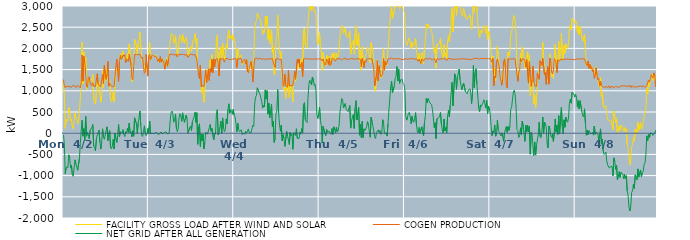
| Category | FACILITY GROSS LOAD AFTER WIND AND SOLAR | COGEN PRODUCTION | NET GRID AFTER ALL GENERATION |
|---|---|---|---|
|  Mon  4/2 | 1227 | 1265 | -38 |
|  Mon  4/2 | 881 | 1117 | -236 |
|  Mon  4/2 | 114 | 1072 | -958 |
|  Mon  4/2 | 292 | 1110 | -818 |
|  Mon  4/2 | 326 | 1113 | -787 |
|  Mon  4/2 | 286 | 1098 | -812 |
|  Mon  4/2 | 604 | 1113 | -509 |
|  Mon  4/2 | 536 | 1104 | -568 |
|  Mon  4/2 | 297 | 1119 | -822 |
|  Mon  4/2 | 323 | 1080 | -757 |
|  Mon  4/2 | 146 | 1119 | -973 |
|  Mon  4/2 | 102 | 1120 | -1018 |
|  Mon  4/2 | 311 | 1129 | -818 |
|  Mon  4/2 | 479 | 1109 | -630 |
|  Mon  4/2 | 360 | 1078 | -718 |
|  Mon  4/2 | 315 | 1118 | -803 |
|  Mon  4/2 | 221 | 1096 | -875 |
|  Mon  4/2 | 252 | 1116 | -864 |
|  Mon  4/2 | 519 | 1111 | -592 |
|  Mon  4/2 | 826 | 1068 | -242 |
|  Mon  4/2 | 1263 | 1190 | 73 |
|  Mon  4/2 | 2147 | 1844 | 303 |
|  Mon  4/2 | 1159 | 1230 | -71 |
|  Mon  4/2 | 1917 | 1810 | 107 |
|  Mon  4/2 | 1500 | 1674 | -174 |
|  Mon  4/2 | 1788 | 1394 | 394 |
|  Mon  4/2 | 1034 | 1105 | -71 |
|  Mon  4/2 | 1096 | 1081 | 15 |
|  Mon  4/2 | 1267 | 1295 | -28 |
|  Mon  4/2 | 1197 | 1327 | -130 |
|  Mon  4/2 | 1254 | 1184 | 70 |
|  Mon  4/2 | 1237 | 1166 | 71 |
|  Mon  4/2 | 1258 | 1118 | 140 |
|  Mon  4/2 | 1393 | 1189 | 204 |
|  Mon  4/2 | 793 | 1104 | -311 |
|  Mon  4/2 | 773 | 1110 | -337 |
|  Mon  4/2 | 686 | 1104 | -418 |
|  Mon  4/2 | 962 | 1109 | -147 |
|  Mon  4/2 | 1361 | 1402 | -41 |
|  Mon  4/2 | 1109 | 1164 | -55 |
|  Mon  4/2 | 1200 | 1125 | 75 |
|  Mon  4/2 | 904 | 1117 | -213 |
|  Mon  4/2 | 729 | 1104 | -375 |
|  Mon  4/2 | 880 | 1084 | -204 |
|  Mon  4/2 | 1492 | 1388 | 104 |
|  Mon  4/2 | 1077 | 1171 | -94 |
|  Mon  4/2 | 1456 | 1601 | -145 |
|  Mon  4/2 | 1241 | 1405 | -164 |
|  Mon  4/2 | 1331 | 1270 | 61 |
|  Mon  4/2 | 1533 | 1382 | 151 |
|  Mon  4/2 | 1517 | 1694 | -177 |
|  Mon  4/2 | 1113 | 1109 | 4 |
|  Mon  4/2 | 1236 | 1174 | 62 |
|  Mon  4/2 | 789 | 1128 | -339 |
|  Mon  4/2 | 745 | 1116 | -371 |
|  Mon  4/2 | 802 | 1098 | -296 |
|  Mon  4/2 | 972 | 1112 | -140 |
|  Mon  4/2 | 734 | 1105 | -371 |
|  Mon  4/2 | 1343 | 1340 | 3 |
|  Mon  4/2 | 1459 | 1590 | -131 |
|  Mon  4/2 | 1526 | 1744 | -218 |
|  Mon  4/2 | 1399 | 1463 | -64 |
|  Mon  4/2 | 1427 | 1220 | 207 |
|  Mon  4/2 | 1597 | 1684 | -87 |
|  Mon  4/2 | 1875 | 1843 | 32 |
|  Mon  4/2 | 1770 | 1745 | 25 |
|  Mon  4/2 | 1769 | 1771 | -2 |
|  Mon  4/2 | 1933 | 1849 | 84 |
|  Mon  4/2 | 1783 | 1811 | -28 |
|  Mon  4/2 | 1772 | 1852 | -80 |
|  Mon  4/2 | 1702 | 1664 | 38 |
|  Mon  4/2 | 1754 | 1752 | 2 |
|  Mon  4/2 | 1876 | 1754 | 122 |
|  Mon  4/2 | 1714 | 1693 | 21 |
|  Mon  4/2 | 2104 | 1864 | 240 |
|  Mon  4/2 | 1862 | 1858 | 4 |
|  Mon  4/2 | 1646 | 1611 | 35 |
|  Mon  4/2 | 1212 | 1297 | -85 |
|  Mon  4/2 | 1315 | 1256 | 59 |
|  Mon  4/2 | 1502 | 1573 | -71 |
|  Mon  4/2 | 2218 | 1853 | 365 |
|  Mon  4/2 | 2206 | 1836 | 370 |
|  Mon  4/2 | 2082 | 1853 | 229 |
|  Mon  4/2 | 1841 | 1850 | -9 |
|  Mon  4/2 | 2089 | 1854 | 235 |
|  Mon  4/2 | 2215 | 1851 | 364 |
|  Mon  4/2 | 2387 | 1862 | 525 |
|  Mon  4/2 | 2028 | 1853 | 175 |
|  Mon  4/2 | 1723 | 1764 | -41 |
|  Mon  4/2 | 1718 | 1797 | -79 |
|  Mon  4/2 | 1618 | 1576 | 42 |
|  Mon  4/2 | 1586 | 1413 | 173 |
|  Mon  4/2 | 1436 | 1445 | -9 |
|  Mon  4/2 | 1798 | 1857 | -59 |
|  Mon  4/2 | 1521 | 1540 | -19 |
|  Mon  4/2 | 1458 | 1346 | 112 |
|  Tue  4/3 | 1811 | 1821 | -10 |
|  Tue  4/3 | 2143 | 1862 | 281 |
|  Tue  4/3 | 1724 | 1734 | -10 |
|  Tue  4/3 | 1807 | 1812 | -5 |
|  Tue  4/3 | 1837 | 1841 | -4 |
|  Tue  4/3 | 1851 | 1841 | 10 |
|  Tue  4/3 | 1805 | 1814 | -9 |
|  Tue  4/3 | 1810 | 1794 | 16 |
|  Tue  4/3 | 1848 | 1812 | 36 |
|  Tue  4/3 | 1783 | 1771 | 12 |
|  Tue  4/3 | 1717 | 1694 | 23 |
|  Tue  4/3 | 1713 | 1753 | -40 |
|  Tue  4/3 | 1668 | 1672 | -4 |
|  Tue  4/3 | 1792 | 1806 | -14 |
|  Tue  4/3 | 1704 | 1676 | 28 |
|  Tue  4/3 | 1735 | 1748 | -13 |
|  Tue  4/3 | 1737 | 1735 | 2 |
|  Tue  4/3 | 1661 | 1654 | 7 |
|  Tue  4/3 | 1516 | 1510 | 6 |
|  Tue  4/3 | 1704 | 1668 | 36 |
|  Tue  4/3 | 1779 | 1732 | 47 |
|  Tue  4/3 | 1564 | 1581 | -17 |
|  Tue  4/3 | 1674 | 1699 | -25 |
|  Tue  4/3 | 1864 | 1860 | 4 |
|  Tue  4/3 | 2152 | 1864 | 288 |
|  Tue  4/3 | 2340 | 1859 | 481 |
|  Tue  4/3 | 2360 | 1838 | 522 |
|  Tue  4/3 | 2331 | 1866 | 465 |
|  Tue  4/3 | 2120 | 1860 | 260 |
|  Tue  4/3 | 2144 | 1838 | 306 |
|  Tue  4/3 | 2302 | 1852 | 450 |
|  Tue  4/3 | 1991 | 1868 | 123 |
|  Tue  4/3 | 1833 | 1796 | 37 |
|  Tue  4/3 | 1943 | 1852 | 91 |
|  Tue  4/3 | 2225 | 1859 | 366 |
|  Tue  4/3 | 2311 | 1853 | 458 |
|  Tue  4/3 | 2266 | 1857 | 409 |
|  Tue  4/3 | 2140 | 1859 | 281 |
|  Tue  4/3 | 2327 | 1847 | 480 |
|  Tue  4/3 | 2213 | 1858 | 355 |
|  Tue  4/3 | 2118 | 1861 | 257 |
|  Tue  4/3 | 2105 | 1842 | 263 |
|  Tue  4/3 | 2257 | 1833 | 424 |
|  Tue  4/3 | 2194 | 1851 | 343 |
|  Tue  4/3 | 1783 | 1784 | -1 |
|  Tue  4/3 | 1778 | 1788 | -10 |
|  Tue  4/3 | 1984 | 1854 | 130 |
|  Tue  4/3 | 2038 | 1869 | 169 |
|  Tue  4/3 | 1922 | 1862 | 60 |
|  Tue  4/3 | 2115 | 1844 | 271 |
|  Tue  4/3 | 2098 | 1846 | 252 |
|  Tue  4/3 | 2243 | 1853 | 390 |
|  Tue  4/3 | 2348 | 1854 | 494 |
|  Tue  4/3 | 2118 | 1862 | 256 |
|  Tue  4/3 | 2234 | 1751 | 483 |
|  Tue  4/3 | 1484 | 1746 | -262 |
|  Tue  4/3 | 1511 | 1360 | 151 |
|  Tue  4/3 | 1507 | 1286 | 221 |
|  Tue  4/3 | 1284 | 1598 | -314 |
|  Tue  4/3 | 1073 | 1091 | -18 |
|  Tue  4/3 | 945 | 1127 | -182 |
|  Tue  4/3 | 1083 | 1107 | -24 |
|  Tue  4/3 | 731 | 1101 | -370 |
|  Tue  4/3 | 893 | 1107 | -214 |
|  Tue  4/3 | 1513 | 1490 | 23 |
|  Tue  4/3 | 1227 | 1192 | 35 |
|  Tue  4/3 | 1337 | 1360 | -23 |
|  Tue  4/3 | 1505 | 1506 | -1 |
|  Tue  4/3 | 1373 | 1244 | 129 |
|  Tue  4/3 | 1729 | 1524 | 205 |
|  Tue  4/3 | 1486 | 1439 | 47 |
|  Tue  4/3 | 1855 | 1740 | 115 |
|  Tue  4/3 | 1542 | 1428 | 114 |
|  Tue  4/3 | 1595 | 1752 | -157 |
|  Tue  4/3 | 1564 | 1562 | 2 |
|  Tue  4/3 | 1717 | 1739 | -22 |
|  Tue  4/3 | 2206 | 1757 | 449 |
|  Tue  4/3 | 2310 | 1757 | 553 |
|  Tue  4/3 | 1625 | 1662 | -37 |
|  Tue  4/3 | 1351 | 1348 | 3 |
|  Tue  4/3 | 1917 | 1759 | 158 |
|  Tue  4/3 | 2030 | 1746 | 284 |
|  Tue  4/3 | 1749 | 1753 | -4 |
|  Tue  4/3 | 2120 | 1759 | 361 |
|  Tue  4/3 | 1884 | 1754 | 130 |
|  Tue  4/3 | 1711 | 1675 | 36 |
|  Tue  4/3 | 1832 | 1749 | 83 |
|  Tue  4/3 | 2087 | 1750 | 337 |
|  Tue  4/3 | 1987 | 1768 | 219 |
|  Tue  4/3 | 2306 | 1750 | 556 |
|  Tue  4/3 | 2430 | 1737 | 693 |
|  Tue  4/3 | 2226 | 1755 | 471 |
|  Tue  4/3 | 2298 | 1740 | 558 |
|  Tue  4/3 | 2273 | 1761 | 512 |
|  Tue  4/3 | 2191 | 1744 | 447 |
|  Tue  4/3 | 2325 | 1763 | 562 |
|  Wed  4/4 | 2177 | 1757 | 420 |
|  Wed  4/4 | 2142 | 1758 | 384 |
|  Wed  4/4 | 1984 | 1755 | 229 |
|  Wed  4/4 | 1579 | 1546 | 33 |
|  Wed  4/4 | 1996 | 1756 | 240 |
|  Wed  4/4 | 1840 | 1756 | 84 |
|  Wed  4/4 | 1788 | 1749 | 39 |
|  Wed  4/4 | 1817 | 1768 | 49 |
|  Wed  4/4 | 1846 | 1766 | 80 |
|  Wed  4/4 | 1612 | 1650 | -38 |
|  Wed  4/4 | 1659 | 1699 | -40 |
|  Wed  4/4 | 1694 | 1687 | 7 |
|  Wed  4/4 | 1722 | 1746 | -24 |
|  Wed  4/4 | 1675 | 1633 | 42 |
|  Wed  4/4 | 1737 | 1734 | 3 |
|  Wed  4/4 | 1433 | 1451 | -18 |
|  Wed  4/4 | 1523 | 1422 | 101 |
|  Wed  4/4 | 1534 | 1522 | 12 |
|  Wed  4/4 | 1523 | 1510 | 13 |
|  Wed  4/4 | 1704 | 1689 | 15 |
|  Wed  4/4 | 1541 | 1533 | 8 |
|  Wed  4/4 | 1395 | 1206 | 189 |
|  Wed  4/4 | 1675 | 1513 | 162 |
|  Wed  4/4 | 2440 | 1755 | 685 |
|  Wed  4/4 | 2599 | 1750 | 849 |
|  Wed  4/4 | 2654 | 1770 | 884 |
|  Wed  4/4 | 2826 | 1755 | 1071 |
|  Wed  4/4 | 2827 | 1747 | 1080 |
|  Wed  4/4 | 2716 | 1758 | 958 |
|  Wed  4/4 | 2695 | 1769 | 926 |
|  Wed  4/4 | 2658 | 1754 | 904 |
|  Wed  4/4 | 2494 | 1746 | 748 |
|  Wed  4/4 | 2335 | 1742 | 593 |
|  Wed  4/4 | 2417 | 1752 | 665 |
|  Wed  4/4 | 2376 | 1756 | 620 |
|  Wed  4/4 | 2759 | 1739 | 1020 |
|  Wed  4/4 | 2559 | 1752 | 807 |
|  Wed  4/4 | 2761 | 1758 | 1003 |
|  Wed  4/4 | 2213 | 1764 | 449 |
|  Wed  4/4 | 2452 | 1745 | 707 |
|  Wed  4/4 | 2117 | 1752 | 365 |
|  Wed  4/4 | 2293 | 1756 | 537 |
|  Wed  4/4 | 2447 | 1764 | 683 |
|  Wed  4/4 | 1905 | 1755 | 150 |
|  Wed  4/4 | 2036 | 1758 | 278 |
|  Wed  4/4 | 1384 | 1601 | -217 |
|  Wed  4/4 | 1435 | 1551 | -116 |
|  Wed  4/4 | 2204 | 1752 | 452 |
|  Wed  4/4 | 2283 | 1750 | 533 |
|  Wed  4/4 | 2788 | 1762 | 1026 |
|  Wed  4/4 | 2243 | 1763 | 480 |
|  Wed  4/4 | 1922 | 1736 | 186 |
|  Wed  4/4 | 1772 | 1725 | 47 |
|  Wed  4/4 | 1934 | 1744 | 190 |
|  Wed  4/4 | 1310 | 1486 | -176 |
|  Wed  4/4 | 1071 | 1106 | -35 |
|  Wed  4/4 | 1022 | 1143 | -121 |
|  Wed  4/4 | 1077 | 1388 | -311 |
|  Wed  4/4 | 817 | 1121 | -304 |
|  Wed  4/4 | 1165 | 1122 | 43 |
|  Wed  4/4 | 1028 | 1085 | -57 |
|  Wed  4/4 | 1424 | 1485 | -61 |
|  Wed  4/4 | 849 | 1116 | -267 |
|  Wed  4/4 | 1140 | 1119 | 21 |
|  Wed  4/4 | 1066 | 1128 | -62 |
|  Wed  4/4 | 1089 | 1114 | -25 |
|  Wed  4/4 | 740 | 1119 | -379 |
|  Wed  4/4 | 1294 | 1279 | 15 |
|  Wed  4/4 | 1436 | 1458 | -22 |
|  Wed  4/4 | 1218 | 1271 | -53 |
|  Wed  4/4 | 1375 | 1270 | 105 |
|  Wed  4/4 | 1621 | 1742 | -121 |
|  Wed  4/4 | 1518 | 1658 | -140 |
|  Wed  4/4 | 1625 | 1750 | -125 |
|  Wed  4/4 | 1588 | 1559 | 29 |
|  Wed  4/4 | 1568 | 1591 | -23 |
|  Wed  4/4 | 1776 | 1667 | 109 |
|  Wed  4/4 | 1334 | 1330 | 4 |
|  Wed  4/4 | 2425 | 1753 | 672 |
|  Wed  4/4 | 2480 | 1761 | 719 |
|  Wed  4/4 | 2077 | 1759 | 318 |
|  Wed  4/4 | 2036 | 1761 | 275 |
|  Wed  4/4 | 2004 | 1753 | 251 |
|  Wed  4/4 | 2586 | 1758 | 828 |
|  Wed  4/4 | 2891 | 1749 | 1142 |
|  Wed  4/4 | 3004 | 1756 | 1248 |
|  Wed  4/4 | 3007 | 1750 | 1257 |
|  Wed  4/4 | 2885 | 1744 | 1141 |
|  Wed  4/4 | 3069 | 1743 | 1326 |
|  Wed  4/4 | 3009 | 1753 | 1256 |
|  Wed  4/4 | 2876 | 1752 | 1124 |
|  Wed  4/4 | 2912 | 1759 | 1153 |
|  Wed  4/4 | 2750 | 1750 | 1000 |
|  Wed  4/4 | 2200 | 1754 | 446 |
|  Wed  4/4 | 2094 | 1747 | 347 |
|  Wed  4/4 | 2206 | 1759 | 447 |
|  Thu  4/5 | 2375 | 1759 | 616 |
|  Thu  4/5 | 2046 | 1749 | 297 |
|  Thu  4/5 | 1929 | 1744 | 185 |
|  Thu  4/5 | 1470 | 1703 | -233 |
|  Thu  4/5 | 1911 | 1748 | 163 |
|  Thu  4/5 | 1926 | 1765 | 161 |
|  Thu  4/5 | 1606 | 1604 | 2 |
|  Thu  4/5 | 1575 | 1632 | -57 |
|  Thu  4/5 | 1838 | 1751 | 87 |
|  Thu  4/5 | 1732 | 1709 | 23 |
|  Thu  4/5 | 1636 | 1619 | 17 |
|  Thu  4/5 | 1813 | 1766 | 47 |
|  Thu  4/5 | 1598 | 1599 | -1 |
|  Thu  4/5 | 1601 | 1628 | -27 |
|  Thu  4/5 | 1872 | 1762 | 110 |
|  Thu  4/5 | 1730 | 1757 | -27 |
|  Thu  4/5 | 1902 | 1751 | 151 |
|  Thu  4/5 | 1839 | 1740 | 99 |
|  Thu  4/5 | 1701 | 1698 | 3 |
|  Thu  4/5 | 1896 | 1757 | 139 |
|  Thu  4/5 | 1789 | 1756 | 33 |
|  Thu  4/5 | 1816 | 1751 | 65 |
|  Thu  4/5 | 1952 | 1760 | 192 |
|  Thu  4/5 | 2274 | 1763 | 511 |
|  Thu  4/5 | 2422 | 1768 | 654 |
|  Thu  4/5 | 2544 | 1726 | 818 |
|  Thu  4/5 | 2512 | 1739 | 773 |
|  Thu  4/5 | 2359 | 1759 | 600 |
|  Thu  4/5 | 2352 | 1745 | 607 |
|  Thu  4/5 | 2472 | 1771 | 701 |
|  Thu  4/5 | 2295 | 1732 | 563 |
|  Thu  4/5 | 2292 | 1746 | 546 |
|  Thu  4/5 | 2259 | 1750 | 509 |
|  Thu  4/5 | 2245 | 1731 | 514 |
|  Thu  4/5 | 2403 | 1749 | 654 |
|  Thu  4/5 | 1860 | 1740 | 120 |
|  Thu  4/5 | 2047 | 1762 | 285 |
|  Thu  4/5 | 2156 | 1774 | 382 |
|  Thu  4/5 | 2190 | 1754 | 436 |
|  Thu  4/5 | 1863 | 1748 | 115 |
|  Thu  4/5 | 2337 | 1746 | 591 |
|  Thu  4/5 | 2531 | 1762 | 769 |
|  Thu  4/5 | 2071 | 1758 | 313 |
|  Thu  4/5 | 2213 | 1746 | 467 |
|  Thu  4/5 | 2368 | 1756 | 612 |
|  Thu  4/5 | 1695 | 1742 | -47 |
|  Thu  4/5 | 1946 | 1737 | 209 |
|  Thu  4/5 | 1469 | 1570 | -101 |
|  Thu  4/5 | 2038 | 1762 | 276 |
|  Thu  4/5 | 1588 | 1694 | -106 |
|  Thu  4/5 | 1653 | 1550 | 103 |
|  Thu  4/5 | 1773 | 1704 | 69 |
|  Thu  4/5 | 1772 | 1673 | 99 |
|  Thu  4/5 | 1909 | 1745 | 164 |
|  Thu  4/5 | 2029 | 1758 | 271 |
|  Thu  4/5 | 1948 | 1760 | 188 |
|  Thu  4/5 | 1796 | 1758 | 38 |
|  Thu  4/5 | 1656 | 1752 | -96 |
|  Thu  4/5 | 2136 | 1763 | 373 |
|  Thu  4/5 | 2037 | 1756 | 281 |
|  Thu  4/5 | 1940 | 1762 | 178 |
|  Thu  4/5 | 1729 | 1530 | 199 |
|  Thu  4/5 | 1027 | 1114 | -87 |
|  Thu  4/5 | 981 | 1105 | -124 |
|  Thu  4/5 | 1361 | 1348 | 13 |
|  Thu  4/5 | 1739 | 1712 | 27 |
|  Thu  4/5 | 1314 | 1235 | 79 |
|  Thu  4/5 | 1604 | 1593 | 11 |
|  Thu  4/5 | 1503 | 1435 | 68 |
|  Thu  4/5 | 1301 | 1330 | -29 |
|  Thu  4/5 | 1325 | 1327 | -2 |
|  Thu  4/5 | 1711 | 1392 | 319 |
|  Thu  4/5 | 1995 | 1761 | 234 |
|  Thu  4/5 | 1479 | 1487 | -8 |
|  Thu  4/5 | 1682 | 1702 | -20 |
|  Thu  4/5 | 1614 | 1609 | 5 |
|  Thu  4/5 | 1589 | 1657 | -68 |
|  Thu  4/5 | 1970 | 1757 | 213 |
|  Thu  4/5 | 2309 | 1760 | 549 |
|  Thu  4/5 | 2566 | 1758 | 808 |
|  Thu  4/5 | 2851 | 1764 | 1087 |
|  Thu  4/5 | 3005 | 1774 | 1231 |
|  Thu  4/5 | 2711 | 1752 | 959 |
|  Thu  4/5 | 2690 | 1737 | 953 |
|  Thu  4/5 | 2875 | 1768 | 1107 |
|  Thu  4/5 | 3030 | 1744 | 1286 |
|  Thu  4/5 | 3091 | 1755 | 1336 |
|  Thu  4/5 | 3336 | 1764 | 1572 |
|  Thu  4/5 | 2988 | 1758 | 1230 |
|  Thu  4/5 | 3267 | 1754 | 1513 |
|  Thu  4/5 | 2940 | 1763 | 1177 |
|  Thu  4/5 | 3004 | 1748 | 1256 |
|  Thu  4/5 | 2997 | 1755 | 1242 |
|  Thu  4/5 | 3000 | 1733 | 1267 |
|  Thu  4/5 | 2922 | 1754 | 1168 |
|  Thu  4/5 | 2887 | 1744 | 1143 |
|  Fri  4/6 | 2771 | 1754 | 1017 |
|  Fri  4/6 | 2153 | 1761 | 392 |
|  Fri  4/6 | 2071 | 1763 | 308 |
|  Fri  4/6 | 2127 | 1742 | 385 |
|  Fri  4/6 | 2214 | 1749 | 465 |
|  Fri  4/6 | 2248 | 1754 | 494 |
|  Fri  4/6 | 2143 | 1757 | 386 |
|  Fri  4/6 | 1987 | 1762 | 225 |
|  Fri  4/6 | 2153 | 1757 | 396 |
|  Fri  4/6 | 2044 | 1756 | 288 |
|  Fri  4/6 | 2021 | 1763 | 258 |
|  Fri  4/6 | 2092 | 1743 | 349 |
|  Fri  4/6 | 2243 | 1759 | 484 |
|  Fri  4/6 | 1962 | 1757 | 205 |
|  Fri  4/6 | 1780 | 1744 | 36 |
|  Fri  4/6 | 1702 | 1697 | 5 |
|  Fri  4/6 | 1883 | 1746 | 137 |
|  Fri  4/6 | 1729 | 1728 | 1 |
|  Fri  4/6 | 1633 | 1641 | -8 |
|  Fri  4/6 | 1903 | 1752 | 151 |
|  Fri  4/6 | 1865 | 1737 | 128 |
|  Fri  4/6 | 1638 | 1700 | -62 |
|  Fri  4/6 | 1993 | 1749 | 244 |
|  Fri  4/6 | 2181 | 1766 | 415 |
|  Fri  4/6 | 2576 | 1759 | 817 |
|  Fri  4/6 | 2472 | 1754 | 718 |
|  Fri  4/6 | 2566 | 1748 | 818 |
|  Fri  4/6 | 2526 | 1749 | 777 |
|  Fri  4/6 | 2490 | 1775 | 715 |
|  Fri  4/6 | 2481 | 1744 | 737 |
|  Fri  4/6 | 2411 | 1737 | 674 |
|  Fri  4/6 | 2291 | 1730 | 561 |
|  Fri  4/6 | 2311 | 1743 | 568 |
|  Fri  4/6 | 1892 | 1759 | 133 |
|  Fri  4/6 | 2018 | 1770 | 248 |
|  Fri  4/6 | 1536 | 1662 | -126 |
|  Fri  4/6 | 2092 | 1752 | 340 |
|  Fri  4/6 | 2099 | 1759 | 340 |
|  Fri  4/6 | 2107 | 1744 | 363 |
|  Fri  4/6 | 2151 | 1745 | 406 |
|  Fri  4/6 | 2238 | 1750 | 488 |
|  Fri  4/6 | 1948 | 1732 | 216 |
|  Fri  4/6 | 1844 | 1762 | 82 |
|  Fri  4/6 | 1758 | 1753 | 5 |
|  Fri  4/6 | 2086 | 1753 | 333 |
|  Fri  4/6 | 1817 | 1762 | 55 |
|  Fri  4/6 | 1885 | 1753 | 132 |
|  Fri  4/6 | 1725 | 1714 | 11 |
|  Fri  4/6 | 2151 | 1753 | 398 |
|  Fri  4/6 | 2297 | 1760 | 537 |
|  Fri  4/6 | 2151 | 1763 | 388 |
|  Fri  4/6 | 2412 | 1754 | 658 |
|  Fri  4/6 | 2704 | 1745 | 959 |
|  Fri  4/6 | 2941 | 1742 | 1199 |
|  Fri  4/6 | 2391 | 1745 | 646 |
|  Fri  4/6 | 2395 | 1761 | 634 |
|  Fri  4/6 | 3145 | 1746 | 1399 |
|  Fri  4/6 | 3062 | 1745 | 1317 |
|  Fri  4/6 | 2775 | 1742 | 1033 |
|  Fri  4/6 | 3078 | 1745 | 1333 |
|  Fri  4/6 | 3151 | 1755 | 1396 |
|  Fri  4/6 | 3272 | 1760 | 1512 |
|  Fri  4/6 | 3001 | 1741 | 1260 |
|  Fri  4/6 | 2991 | 1742 | 1249 |
|  Fri  4/6 | 2783 | 1759 | 1024 |
|  Fri  4/6 | 2756 | 1751 | 1005 |
|  Fri  4/6 | 2937 | 1756 | 1181 |
|  Fri  4/6 | 2919 | 1744 | 1175 |
|  Fri  4/6 | 2735 | 1745 | 990 |
|  Fri  4/6 | 2719 | 1761 | 958 |
|  Fri  4/6 | 2686 | 1756 | 930 |
|  Fri  4/6 | 2750 | 1755 | 995 |
|  Fri  4/6 | 2725 | 1732 | 993 |
|  Fri  4/6 | 2792 | 1742 | 1050 |
|  Fri  4/6 | 2698 | 1743 | 955 |
|  Fri  4/6 | 2449 | 1749 | 700 |
|  Fri  4/6 | 2695 | 1741 | 954 |
|  Fri  4/6 | 3349 | 1754 | 1595 |
|  Fri  4/6 | 2846 | 1770 | 1076 |
|  Fri  4/6 | 3184 | 1757 | 1427 |
|  Fri  4/6 | 3281 | 1763 | 1518 |
|  Fri  4/6 | 2892 | 1746 | 1146 |
|  Fri  4/6 | 2887 | 1761 | 1126 |
|  Fri  4/6 | 2347 | 1762 | 585 |
|  Fri  4/6 | 2256 | 1747 | 509 |
|  Fri  4/6 | 2435 | 1768 | 667 |
|  Fri  4/6 | 2393 | 1763 | 630 |
|  Fri  4/6 | 2364 | 1756 | 608 |
|  Fri  4/6 | 2487 | 1757 | 730 |
|  Fri  4/6 | 2539 | 1749 | 790 |
|  Fri  4/6 | 2460 | 1764 | 696 |
|  Fri  4/6 | 2350 | 1753 | 597 |
|  Fri  4/6 | 2532 | 1758 | 774 |
|  Fri  4/6 | 2206 | 1751 | 455 |
|  Fri  4/6 | 2397 | 1758 | 639 |
|  Fri  4/6 | 2356 | 1761 | 595 |
|  Sat  4/7 | 2199 | 1755 | 444 |
|  Sat  4/7 | 1899 | 1743 | 156 |
|  Sat  4/7 | 1614 | 1674 | -60 |
|  Sat  4/7 | 1822 | 1767 | 55 |
|  Sat  4/7 | 1130 | 1118 | 12 |
|  Sat  4/7 | 1538 | 1345 | 193 |
|  Sat  4/7 | 1231 | 1302 | -71 |
|  Sat  4/7 | 1676 | 1693 | -17 |
|  Sat  4/7 | 2062 | 1751 | 311 |
|  Sat  4/7 | 1826 | 1757 | 69 |
|  Sat  4/7 | 1591 | 1565 | 26 |
|  Sat  4/7 | 1330 | 1342 | -12 |
|  Sat  4/7 | 1281 | 1345 | -64 |
|  Sat  4/7 | 1141 | 1132 | 9 |
|  Sat  4/7 | 1189 | 1269 | -80 |
|  Sat  4/7 | 1483 | 1679 | -196 |
|  Sat  4/7 | 1768 | 1755 | 13 |
|  Sat  4/7 | 1582 | 1562 | 20 |
|  Sat  4/7 | 1318 | 1164 | 154 |
|  Sat  4/7 | 1092 | 1073 | 19 |
|  Sat  4/7 | 1912 | 1755 | 157 |
|  Sat  4/7 | 1821 | 1754 | 67 |
|  Sat  4/7 | 1904 | 1749 | 155 |
|  Sat  4/7 | 2327 | 1762 | 565 |
|  Sat  4/7 | 2360 | 1749 | 611 |
|  Sat  4/7 | 2565 | 1757 | 808 |
|  Sat  4/7 | 2729 | 1758 | 971 |
|  Sat  4/7 | 2780 | 1767 | 1013 |
|  Sat  4/7 | 2657 | 1745 | 912 |
|  Sat  4/7 | 2372 | 1759 | 613 |
|  Sat  4/7 | 1467 | 1383 | 84 |
|  Sat  4/7 | 1282 | 1222 | 60 |
|  Sat  4/7 | 1317 | 1419 | -102 |
|  Sat  4/7 | 1434 | 1501 | -67 |
|  Sat  4/7 | 1890 | 1763 | 127 |
|  Sat  4/7 | 1664 | 1694 | -30 |
|  Sat  4/7 | 2037 | 1750 | 287 |
|  Sat  4/7 | 1916 | 1743 | 173 |
|  Sat  4/7 | 1904 | 1750 | 154 |
|  Sat  4/7 | 1515 | 1708 | -193 |
|  Sat  4/7 | 1746 | 1558 | 188 |
|  Sat  4/7 | 1765 | 1734 | 31 |
|  Sat  4/7 | 1931 | 1744 | 187 |
|  Sat  4/7 | 1209 | 1181 | 28 |
|  Sat  4/7 | 1851 | 1685 | 166 |
|  Sat  4/7 | 889 | 1383 | -494 |
|  Sat  4/7 | 1123 | 1106 | 17 |
|  Sat  4/7 | 1222 | 1266 | -44 |
|  Sat  4/7 | 1523 | 1581 | -58 |
|  Sat  4/7 | 692 | 1216 | -524 |
|  Sat  4/7 | 907 | 1113 | -206 |
|  Sat  4/7 | 594 | 1109 | -515 |
|  Sat  4/7 | 814 | 1101 | -287 |
|  Sat  4/7 | 1258 | 1421 | -163 |
|  Sat  4/7 | 1312 | 1333 | -21 |
|  Sat  4/7 | 1529 | 1271 | 258 |
|  Sat  4/7 | 1632 | 1710 | -78 |
|  Sat  4/7 | 1573 | 1682 | -109 |
|  Sat  4/7 | 1604 | 1598 | 6 |
|  Sat  4/7 | 2147 | 1764 | 383 |
|  Sat  4/7 | 1754 | 1757 | -3 |
|  Sat  4/7 | 1645 | 1383 | 262 |
|  Sat  4/7 | 1658 | 1427 | 231 |
|  Sat  4/7 | 1276 | 1151 | 125 |
|  Sat  4/7 | 1233 | 1495 | -262 |
|  Sat  4/7 | 1223 | 1572 | -349 |
|  Sat  4/7 | 1328 | 1157 | 171 |
|  Sat  4/7 | 1874 | 1767 | 107 |
|  Sat  4/7 | 1641 | 1690 | -49 |
|  Sat  4/7 | 1339 | 1437 | -98 |
|  Sat  4/7 | 1383 | 1399 | -16 |
|  Sat  4/7 | 1293 | 1486 | -193 |
|  Sat  4/7 | 1776 | 1758 | 18 |
|  Sat  4/7 | 2093 | 1758 | 335 |
|  Sat  4/7 | 1695 | 1672 | 23 |
|  Sat  4/7 | 1613 | 1428 | 185 |
|  Sat  4/7 | 1701 | 1729 | -28 |
|  Sat  4/7 | 2163 | 1750 | 413 |
|  Sat  4/7 | 1693 | 1701 | -8 |
|  Sat  4/7 | 1749 | 1750 | -1 |
|  Sat  4/7 | 2352 | 1748 | 604 |
|  Sat  4/7 | 1889 | 1734 | 155 |
|  Sat  4/7 | 1734 | 1746 | -12 |
|  Sat  4/7 | 2070 | 1753 | 317 |
|  Sat  4/7 | 1884 | 1744 | 140 |
|  Sat  4/7 | 2105 | 1730 | 375 |
|  Sat  4/7 | 2045 | 1757 | 288 |
|  Sat  4/7 | 2001 | 1743 | 258 |
|  Sat  4/7 | 2104 | 1746 | 358 |
|  Sat  4/7 | 2453 | 1749 | 704 |
|  Sat  4/7 | 2541 | 1738 | 803 |
|  Sat  4/7 | 2442 | 1734 | 708 |
|  Sat  4/7 | 2710 | 1743 | 967 |
|  Sat  4/7 | 2701 | 1753 | 948 |
|  Sat  4/7 | 2663 | 1732 | 931 |
|  Sat  4/7 | 2587 | 1738 | 849 |
|  Sun  4/8 | 2655 | 1740 | 915 |
|  Sun  4/8 | 2611 | 1762 | 849 |
|  Sun  4/8 | 2371 | 1756 | 615 |
|  Sun  4/8 | 2526 | 1756 | 770 |
|  Sun  4/8 | 2318 | 1746 | 572 |
|  Sun  4/8 | 2517 | 1751 | 766 |
|  Sun  4/8 | 2510 | 1748 | 762 |
|  Sun  4/8 | 2260 | 1751 | 509 |
|  Sun  4/8 | 2168 | 1757 | 411 |
|  Sun  4/8 | 2149 | 1768 | 381 |
|  Sun  4/8 | 2329 | 1753 | 576 |
|  Sun  4/8 | 2005 | 1769 | 236 |
|  Sun  4/8 | 1581 | 1630 | -49 |
|  Sun  4/8 | 1663 | 1587 | 76 |
|  Sun  4/8 | 1664 | 1703 | -39 |
|  Sun  4/8 | 1589 | 1529 | 60 |
|  Sun  4/8 | 1638 | 1620 | 18 |
|  Sun  4/8 | 1507 | 1527 | -20 |
|  Sun  4/8 | 1571 | 1569 | 2 |
|  Sun  4/8 | 1469 | 1454 | 15 |
|  Sun  4/8 | 1453 | 1498 | -45 |
|  Sun  4/8 | 1462 | 1294 | 168 |
|  Sun  4/8 | 1343 | 1370 | -27 |
|  Sun  4/8 | 1565 | 1543 | 22 |
|  Sun  4/8 | 1397 | 1376 | 21 |
|  Sun  4/8 | 1256 | 1256 | 0 |
|  Sun  4/8 | 1104 | 1296 | -192 |
|  Sun  4/8 | 1087 | 1114 | -27 |
|  Sun  4/8 | 1326 | 1224 | 102 |
|  Sun  4/8 | 858 | 1118 | -260 |
|  Sun  4/8 | 957 | 1095 | -138 |
|  Sun  4/8 | 668 | 1084 | -416 |
|  Sun  4/8 | 590 | 1092 | -502 |
|  Sun  4/8 | 574 | 1089 | -515 |
|  Sun  4/8 | 649 | 1095 | -446 |
|  Sun  4/8 | 447 | 1101 | -654 |
|  Sun  4/8 | 322 | 1070 | -748 |
|  Sun  4/8 | 308 | 1073 | -765 |
|  Sun  4/8 | 296 | 1119 | -823 |
|  Sun  4/8 | 273 | 1061 | -788 |
|  Sun  4/8 | 293 | 1102 | -809 |
|  Sun  4/8 | 311 | 1095 | -784 |
|  Sun  4/8 | 83 | 1089 | -1006 |
|  Sun  4/8 | 521 | 1103 | -582 |
|  Sun  4/8 | 423 | 1081 | -658 |
|  Sun  4/8 | 253 | 1106 | -853 |
|  Sun  4/8 | 359 | 1111 | -752 |
|  Sun  4/8 | -10 | 1089 | -1099 |
|  Sun  4/8 | 80 | 1100 | -1020 |
|  Sun  4/8 | 172 | 1080 | -908 |
|  Sun  4/8 | 69 | 1110 | -1041 |
|  Sun  4/8 | 189 | 1111 | -922 |
|  Sun  4/8 | 206 | 1117 | -911 |
|  Sun  4/8 | 141 | 1104 | -963 |
|  Sun  4/8 | 47 | 1118 | -1071 |
|  Sun  4/8 | 131 | 1102 | -971 |
|  Sun  4/8 | 33 | 1114 | -1081 |
|  Sun  4/8 | 104 | 1107 | -1003 |
|  Sun  4/8 | -262 | 1099 | -1361 |
|  Sun  4/8 | -364 | 1107 | -1471 |
|  Sun  4/8 | -632 | 1126 | -1758 |
|  Sun  4/8 | -744 | 1089 | -1833 |
|  Sun  4/8 | -590 | 1127 | -1717 |
|  Sun  4/8 | -318 | 1075 | -1393 |
|  Sun  4/8 | -266 | 1096 | -1362 |
|  Sun  4/8 | -90 | 1116 | -1206 |
|  Sun  4/8 | -190 | 1112 | -1302 |
|  Sun  4/8 | 96 | 1078 | -982 |
|  Sun  4/8 | 76 | 1091 | -1015 |
|  Sun  4/8 | -2 | 1097 | -1099 |
|  Sun  4/8 | 264 | 1105 | -841 |
|  Sun  4/8 | 68 | 1104 | -1036 |
|  Sun  4/8 | 79 | 1118 | -1039 |
|  Sun  4/8 | 249 | 1116 | -867 |
|  Sun  4/8 | 93 | 1123 | -1030 |
|  Sun  4/8 | 163 | 1090 | -927 |
|  Sun  4/8 | 223 | 1123 | -900 |
|  Sun  4/8 | 390 | 1122 | -732 |
|  Sun  4/8 | 375 | 1079 | -704 |
|  Sun  4/8 | 592 | 1090 | -498 |
|  Sun  4/8 | 1052 | 1116 | -64 |
|  Sun  4/8 | 926 | 1104 | -178 |
|  Sun  4/8 | 1234 | 1254 | -20 |
|  Sun  4/8 | 1097 | 1201 | -104 |
|  Sun  4/8 | 1291 | 1288 | 3 |
|  Sun  4/8 | 1369 | 1381 | -12 |
|  Sun  4/8 | 1394 | 1399 | -5 |
|  Sun  4/8 | 1247 | 1299 | -52 |
|  Sun  4/8 | 1401 | 1423 | -22 |
|  Sun  4/8 | 1362 | 1358 | 4 |
|  Sun  4/8 | 1165 | 1100 | 65 |
|  Sun  4/8 | 1324 | 1324 | 0 |